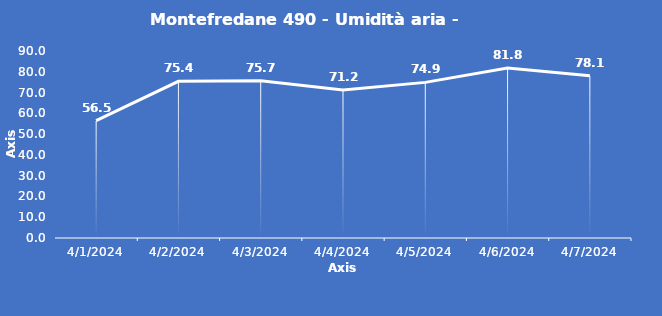
| Category | Montefredane 490 - Umidità aria - Grezzo (%) |
|---|---|
| 4/1/24 | 56.5 |
| 4/2/24 | 75.4 |
| 4/3/24 | 75.7 |
| 4/4/24 | 71.2 |
| 4/5/24 | 74.9 |
| 4/6/24 | 81.8 |
| 4/7/24 | 78.1 |